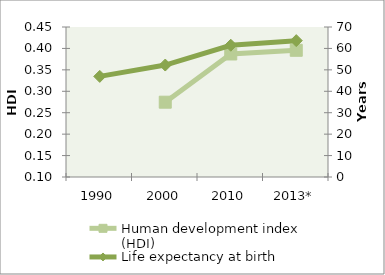
| Category | Human development index (HDI) |
|---|---|
| 1990 | 0 |
| 2000 | 0.275 |
| 2010 | 0.387 |
| 2013* | 0.396 |